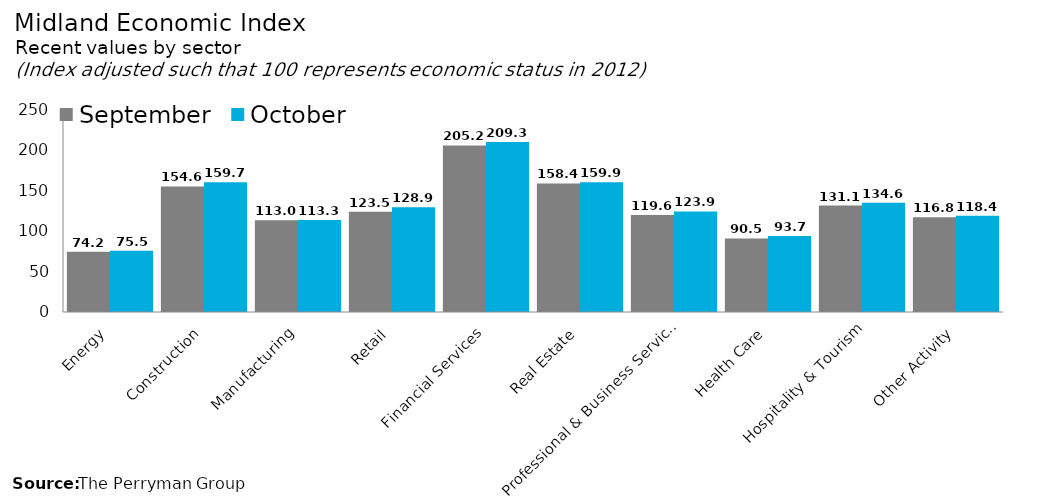
| Category | September | October |
|---|---|---|
| Energy | 74.212 | 75.537 |
| Construction | 154.586 | 159.695 |
| Manufacturing | 113.011 | 113.272 |
| Retail | 123.536 | 128.913 |
| Financial Services | 205.203 | 209.322 |
| Real Estate | 158.36 | 159.926 |
| Professional & Business Services | 119.596 | 123.92 |
| Health Care | 90.522 | 93.65 |
| Hospitality & Tourism | 131.101 | 134.634 |
| Other Activity | 116.797 | 118.418 |